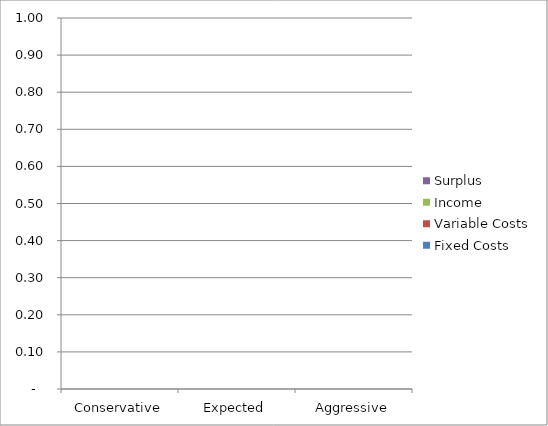
| Category | Fixed Costs | Variable Costs | Income | Surplus |
|---|---|---|---|---|
| Conservative | 0 | 0 | 0 | 0 |
| Expected | 0 | 0 | 0 | 0 |
| Aggressive | 0 | 0 | 0 | 0 |